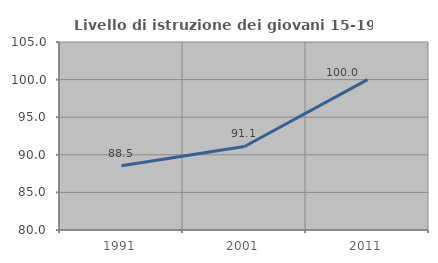
| Category | Livello di istruzione dei giovani 15-19 anni |
|---|---|
| 1991.0 | 88.542 |
| 2001.0 | 91.111 |
| 2011.0 | 100 |